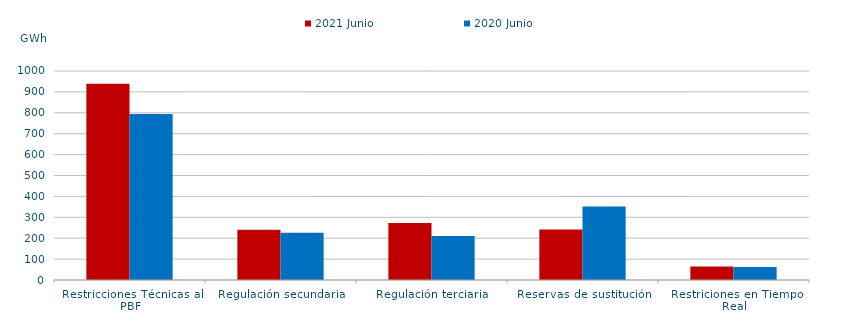
| Category | 2021 Junio | 2020 Junio |
|---|---|---|
| Restricciones Técnicas al PBF | 938.481 | 794.277 |
| Regulación secundaria | 240.595 | 225.893 |
| Regulación terciaria | 272.53 | 210.781 |
| Reservas de sustitución | 242.035 | 351.429 |
| Restriciones en Tiempo Real | 64.481 | 62.657 |